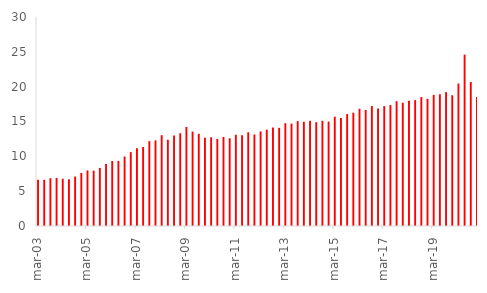
| Category | %PIB |
|---|---|
| 2003-03-01 | 6.652 |
| 2003-06-01 | 6.629 |
| 2003-09-01 | 6.866 |
| 2003-12-01 | 6.909 |
| 2004-03-01 | 6.783 |
| 2004-06-01 | 6.706 |
| 2004-09-01 | 7.101 |
| 2004-12-01 | 7.621 |
| 2005-03-01 | 7.973 |
| 2005-06-01 | 7.944 |
| 2005-09-01 | 8.335 |
| 2005-12-01 | 8.911 |
| 2006-03-01 | 9.331 |
| 2006-06-01 | 9.349 |
| 2006-09-01 | 9.98 |
| 2006-12-01 | 10.609 |
| 2007-03-01 | 11.153 |
| 2007-06-01 | 11.34 |
| 2007-09-01 | 12.182 |
| 2007-12-01 | 12.293 |
| 2008-03-01 | 13.036 |
| 2008-06-01 | 12.382 |
| 2008-09-01 | 12.976 |
| 2008-12-01 | 13.319 |
| 2009-03-01 | 14.223 |
| 2009-06-01 | 13.555 |
| 2009-09-01 | 13.237 |
| 2009-12-01 | 12.667 |
| 2010-03-01 | 12.735 |
| 2010-06-01 | 12.491 |
| 2010-09-01 | 12.79 |
| 2010-12-01 | 12.593 |
| 2011-03-01 | 13.095 |
| 2011-06-01 | 13.02 |
| 2011-09-01 | 13.457 |
| 2011-12-01 | 13.137 |
| 2012-03-01 | 13.578 |
| 2012-06-01 | 13.822 |
| 2012-09-01 | 14.139 |
| 2012-12-01 | 14.089 |
| 2013-03-01 | 14.752 |
| 2013-06-01 | 14.698 |
| 2013-09-01 | 15.058 |
| 2013-12-01 | 14.964 |
| 2014-03-01 | 15.092 |
| 2014-06-01 | 14.902 |
| 2014-09-01 | 15.106 |
| 2014-12-01 | 14.993 |
| 2015-03-01 | 15.692 |
| 2015-06-01 | 15.492 |
| 2015-09-01 | 16.066 |
| 2015-12-01 | 16.262 |
| 2016-03-01 | 16.824 |
| 2016-06-01 | 16.663 |
| 2016-09-01 | 17.215 |
| 2016-12-01 | 16.883 |
| 2017-03-01 | 17.213 |
| 2017-06-01 | 17.364 |
| 2017-09-01 | 17.919 |
| 2017-12-01 | 17.698 |
| 2018-03-01 | 17.985 |
| 2018-06-01 | 18.074 |
| 2018-09-01 | 18.507 |
| 2018-12-01 | 18.26 |
| 2019-03-01 | 18.824 |
| 2019-06-01 | 18.906 |
| 2019-09-01 | 19.212 |
| 2019-12-01 | 18.77 |
| 2020-03-01 | 20.454 |
| 2020-06-01 | 24.602 |
| 2020-09-01 | 20.667 |
| 2020-12-01 | 18.502 |
| #N/A | 0 |
| #N/A | 0 |
| #N/A | 0 |
| #N/A | 0 |
| #N/A | 0 |
| #N/A | 0 |
| #N/A | 0 |
| #N/A | 0 |
| #N/A | 0 |
| #N/A | 0 |
| #N/A | 0 |
| #N/A | 0 |
| #N/A | 0 |
| #N/A | 0 |
| #N/A | 0 |
| #N/A | 0 |
| #N/A | 0 |
| #N/A | 0 |
| #N/A | 0 |
| #N/A | 0 |
| #N/A | 0 |
| #N/A | 0 |
| #N/A | 0 |
| #N/A | 0 |
| #N/A | 0 |
| #N/A | 0 |
| #N/A | 0 |
| #N/A | 0 |
| #N/A | 0 |
| #N/A | 0 |
| #N/A | 0 |
| #N/A | 0 |
| #N/A | 0 |
| #N/A | 0 |
| #N/A | 0 |
| #N/A | 0 |
| #N/A | 0 |
| #N/A | 0 |
| #N/A | 0 |
| #N/A | 0 |
| #N/A | 0 |
| #N/A | 0 |
| #N/A | 0 |
| #N/A | 0 |
| #N/A | 0 |
| #N/A | 0 |
| #N/A | 0 |
| #N/A | 0 |
| #N/A | 0 |
| #N/A | 0 |
| #N/A | 0 |
| #N/A | 0 |
| #N/A | 0 |
| #N/A | 0 |
| #N/A | 0 |
| #N/A | 0 |
| #N/A | 0 |
| #N/A | 0 |
| #N/A | 0 |
| #N/A | 0 |
| #N/A | 0 |
| #N/A | 0 |
| #N/A | 0 |
| #N/A | 0 |
| #N/A | 0 |
| #N/A | 0 |
| #N/A | 0 |
| #N/A | 0 |
| #N/A | 0 |
| #N/A | 0 |
| #N/A | 0 |
| #N/A | 0 |
| #N/A | 0 |
| #N/A | 0 |
| #N/A | 0 |
| #N/A | 0 |
| #N/A | 0 |
| #N/A | 0 |
| #N/A | 0 |
| #N/A | 0 |
| #N/A | 0 |
| #N/A | 0 |
| #N/A | 0 |
| #N/A | 0 |
| #N/A | 0 |
| #N/A | 0 |
| #N/A | 0 |
| #N/A | 0 |
| #N/A | 0 |
| #N/A | 0 |
| #N/A | 0 |
| #N/A | 0 |
| #N/A | 0 |
| #N/A | 0 |
| #N/A | 0 |
| #N/A | 0 |
| #N/A | 0 |
| #N/A | 0 |
| #N/A | 0 |
| #N/A | 0 |
| #N/A | 0 |
| #N/A | 0 |
| #N/A | 0 |
| #N/A | 0 |
| #N/A | 0 |
| #N/A | 0 |
| #N/A | 0 |
| #N/A | 0 |
| #N/A | 0 |
| #N/A | 0 |
| #N/A | 0 |
| #N/A | 0 |
| #N/A | 0 |
| #N/A | 0 |
| #N/A | 0 |
| #N/A | 0 |
| #N/A | 0 |
| #N/A | 0 |
| #N/A | 0 |
| #N/A | 0 |